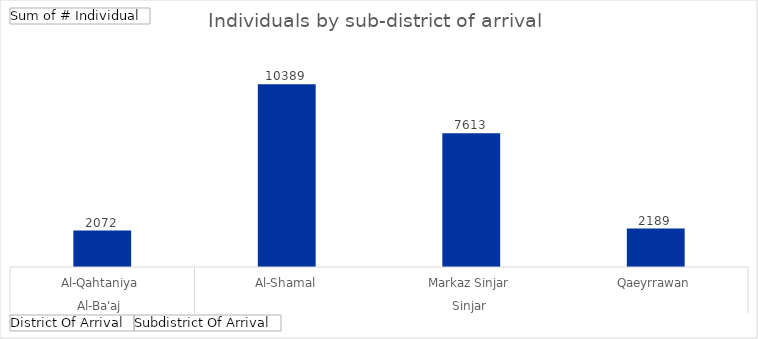
| Category | Total |
|---|---|
| 0 | 2072 |
| 1 | 10389 |
| 2 | 7613 |
| 3 | 2189 |